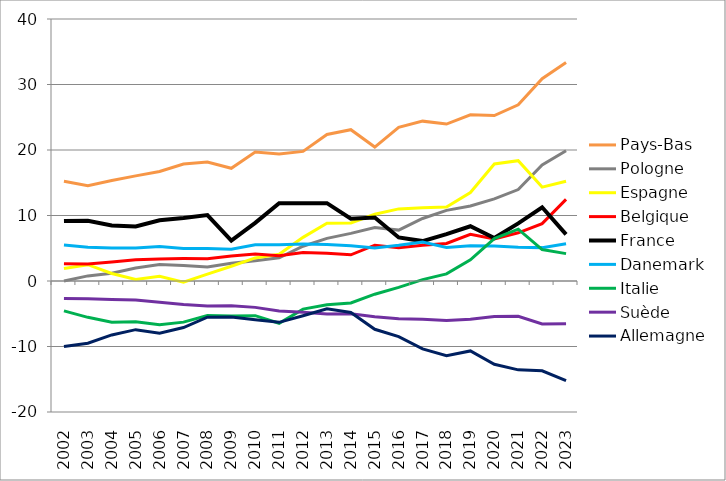
| Category | Pays-Bas | Pologne | Espagne | Belgique | France | Danemark | Italie | Suède | Allemagne |
|---|---|---|---|---|---|---|---|---|---|
| 2002 | 15.233 | 0.003 | 1.925 | 2.625 | 9.147 | 5.479 | -4.555 | -2.658 | -10.01 |
| 2003 | 14.563 | 0.779 | 2.489 | 2.581 | 9.202 | 5.144 | -5.548 | -2.709 | -9.506 |
| 2004 | 15.33 | 1.193 | 1.151 | 2.883 | 8.468 | 5.022 | -6.295 | -2.817 | -8.235 |
| 2005 | 16.046 | 1.993 | 0.222 | 3.238 | 8.319 | 5.052 | -6.207 | -2.913 | -7.428 |
| 2006 | 16.729 | 2.502 | 0.727 | 3.376 | 9.265 | 5.272 | -6.684 | -3.25 | -7.976 |
| 2007 | 17.856 | 2.359 | -0.192 | 3.429 | 9.621 | 4.98 | -6.28 | -3.599 | -7.11 |
| 2008 | 18.176 | 2.123 | 1.049 | 3.411 | 10.06 | 4.952 | -5.271 | -3.823 | -5.524 |
| 2009 | 17.212 | 2.723 | 2.247 | 3.828 | 6.177 | 4.865 | -5.354 | -3.766 | -5.498 |
| 2010 | 19.691 | 3.109 | 3.524 | 4.111 | 8.88 | 5.519 | -5.288 | -4.027 | -5.925 |
| 2011 | 19.378 | 3.541 | 4.09 | 3.858 | 11.867 | 5.553 | -6.458 | -4.579 | -6.312 |
| 2012 | 19.783 | 5.307 | 6.66 | 4.345 | 11.878 | 5.649 | -4.292 | -4.778 | -5.305 |
| 2013 | 22.375 | 6.511 | 8.812 | 4.241 | 11.884 | 5.58 | -3.643 | -5.049 | -4.24 |
| 2014 | 23.099 | 7.272 | 8.866 | 3.999 | 9.513 | 5.368 | -3.356 | -4.995 | -4.811 |
| 2015 | 20.451 | 8.164 | 10.191 | 5.463 | 9.698 | 5.056 | -2.015 | -5.468 | -7.371 |
| 2016 | 23.472 | 7.772 | 11.01 | 5.091 | 6.647 | 5.458 | -0.97 | -5.756 | -8.487 |
| 2017 | 24.405 | 9.54 | 11.185 | 5.462 | 6.092 | 5.942 | 0.204 | -5.848 | -10.36 |
| 2018 | 23.963 | 10.786 | 11.294 | 5.724 | 7.153 | 5.113 | 1.09 | -6.013 | -11.396 |
| 2019 | 25.385 | 11.445 | 13.508 | 7.138 | 8.362 | 5.373 | 3.244 | -5.844 | -10.677 |
| 2020 | 25.251 | 12.528 | 17.864 | 6.4 | 6.569 | 5.358 | 6.481 | -5.417 | -12.705 |
| 2021 | 26.904 | 13.963 | 18.366 | 7.355 | 8.798 | 5.145 | 7.92 | -5.375 | -13.564 |
| 2022 | 30.892 | 17.701 | 14.333 | 8.753 | 11.253 | 5.096 | 4.798 | -6.55 | -13.716 |
| 2023 | 33.375 | 19.891 | 15.228 | 12.464 | 7.111 | 5.695 | 4.18 | -6.519 | -15.224 |